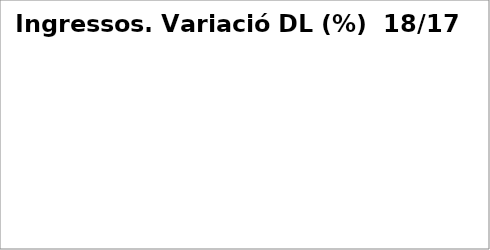
| Category | Series 0 |
|---|---|
| Impostos directes | -0.105 |
| Impostos indirectes | 0.039 |
| Taxes, preus públics i altres ingressos | -0.022 |
| Transferències corrents | 0.043 |
| Ingressos patrimonials | -0.271 |
| Venda d'inversions reals | -0.846 |
| Transferències de capital | 0.561 |
| Actius financers* | 0 |
| Passius financers | 0.412 |